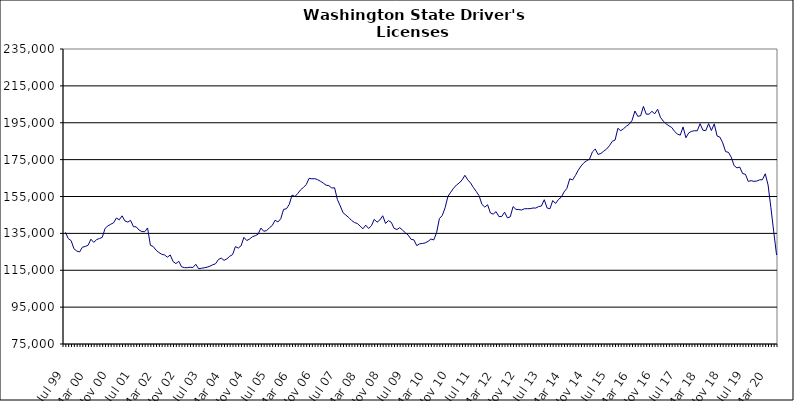
| Category | Series 0 |
|---|---|
| Jul 99 | 135560 |
| Aug 99 | 132182 |
| Sep 99 | 131104 |
| Oct 99 | 126694 |
| Nov 99 | 125425 |
| Dec 99 | 124927 |
| Jan 00 | 127499 |
| Feb 00 | 127927 |
| Mar 00 | 128547 |
| Apr 00 | 131834 |
| May 00 | 130120 |
| Jun 00 | 131595 |
| Jul 00 | 132236 |
| Aug 00 | 132819 |
| Sep 00 | 137711 |
| Oct 00 | 139063 |
| Nov 00 | 139952 |
| Dec 00 | 140732 |
| Jan 01 | 143338 |
| Feb 01 | 142359 |
| Mar 01 | 144523 |
| Apr 01 | 141758 |
| May 01 | 141135 |
| Jun 01 | 142064 |
| Jul 01 | 138646 |
| Aug 01 | 138530 |
| Sep 01 | 136784 |
| Oct 01 | 135996 |
| Nov 01 | 135917 |
| Dec 01 | 137940 |
| Jan 02 | 128531 |
| Feb 02 | 127848 |
| Mar 02 | 125876 |
| Apr 02 | 124595 |
| May 02 | 123660 |
| Jun 02 | 123282 |
| Jul 02 | 122089 |
| Aug 02 | 123279 |
| Sep 02 | 119727 |
| Oct 02 | 118588 |
| Nov 02 | 119854 |
| Dec 02 | 116851 |
| Jan 03 | 116407 |
| Feb 03 | 116382 |
| Mar 03 | 116648 |
| Apr 03 | 116471 |
| May 03 | 118231 |
| Jun 03 | 115831 |
| Jul 03 | 116082 |
| Aug 03 | 116341 |
| Sep 03 | 116653 |
| Oct 03 | 117212 |
| Nov 03 | 117962 |
| Dec 03 | 118542 |
| Jan 04 | 120817 |
| Feb 04 | 121617 |
| Mar 04 | 120369 |
| Apr 04 | 121200 |
| May 04 | 122609 |
| Jun 04 | 123484 |
| Jul 04 | 127844 |
| Aug 04 | 127025 |
| Sep 04 | 128273 |
| Oct 04 | 132853 |
| Nov 04 | 131106 |
| Dec 04 | 131935 |
| Jan 05 | 133205 |
| Feb 05 | 133736 |
| Mar 05 | 134528 |
| Apr 05 | 137889 |
| May 05 | 136130 |
| Jun 05 | 136523 |
| Jul 05 | 137997 |
| Aug 05 | 139294 |
| Sep 05 | 142140 |
| Oct 05 | 141192 |
| Nov 05 | 142937 |
| Dec 05 | 148013 |
| Jan 06 | 148341 |
| Feb 06 | 150744 |
| Mar 06 | 155794 |
| Apr 06 | 154984 |
| May 06 | 156651 |
| Jun 06 | 158638 |
| Jul 06 | 159911 |
| Aug 06 | 161445 |
| Sep 06 | 164852 |
| Oct 06 | 164570 |
| Nov 06 | 164679 |
| Dec 06 | 164127 |
| Jan 07 | 163271 |
| Feb 07 | 162273 |
| Mar 07 | 161140 |
| Apr 07 | 160860 |
| May 07 | 159633 |
| Jun 07 | 159724 |
| Jul 07 | 153303 |
| Aug 07 | 149939 |
| Sep 07 | 146172 |
| Oct 07 | 144876 |
| Nov 07 | 143613 |
| Dec 07 | 142022 |
| Jan 08 | 140909 |
| Feb 08 | 140368 |
| Mar 08 | 138998 |
| Apr 08 | 137471 |
| May 08 | 139453 |
| Jun 08 | 137680 |
| Jul 08 | 139120 |
| Aug 08 | 142612 |
| Sep-08 | 141071 |
| Oct 08 | 142313 |
| Nov 08 | 144556 |
| Dec 08 | 140394 |
| Jan 09 | 141903 |
| Feb 09 | 141036 |
| Mar 09 | 137751 |
| Apr 09 | 137060 |
| May 09 | 138101 |
| Jun 09 | 136739 |
| Jul 09 | 135317 |
| Aug 09 | 134020 |
| Sep 09 | 131756 |
| Oct 09 | 131488 |
| Nov 09 | 128370 |
| Dec 09 | 129323 |
| Jan 10 | 129531 |
| Feb 10 | 129848 |
| Mar 10 | 130654 |
| Apr 10 | 131929 |
| May 10 | 131429 |
| Jun 10 | 135357 |
| Jul 10 | 143032 |
| Aug 10 | 144686 |
| Sep 10 | 148856 |
| Oct 10 | 155042 |
| Nov 10 | 157328 |
| Dec 10 | 159501 |
| Jan 11 | 161221 |
| Feb 11 | 162312 |
| Mar 11 | 163996 |
| Apr 11 | 166495 |
| May 11 | 164040 |
| Jun 11 | 162324 |
| Jul 11 | 159862 |
| Aug 11 | 157738 |
| Sep 11 | 155430 |
| Oct 11 | 150762 |
| Nov 11 | 149255 |
| Dec 11 | 150533 |
| Jan 12 | 146068 |
| Feb 12 | 145446 |
| Mar 12 | 146788 |
| Apr 12 | 144110 |
| May 12 | 144162 |
| Jun 12 | 146482 |
| Jul 12 | 143445 |
| Aug 12 | 143950 |
| Sep 12 | 149520 |
| Oct 12 | 148033 |
| Nov 12 | 147926 |
| Dec 12 | 147674 |
| Jan 13 | 148360 |
| Feb-13 | 148388 |
| Mar-13 | 148414 |
| Apr 13 | 148749 |
| May 13 | 148735 |
| Jun-13 | 149521 |
| Jul 13 | 149837 |
| Aug 13 | 153252 |
| Sep 13 | 148803 |
| Oct 13 | 148315 |
| Nov 13 | 152804 |
| Dec 13 | 151209 |
| Jan 14 | 153357 |
| Feb-14 | 154608 |
| Mar 14 | 157479 |
| Apr 14 | 159441 |
| May 14 | 164591 |
| Jun 14 | 163995 |
| Jul-14 | 166411 |
| Aug-14 | 169272 |
| Sep 14 | 171565 |
| Oct 14 | 173335 |
| Nov 14 | 174406 |
| Dec 14 | 175302 |
| Jan 15 | 179204 |
| Feb 15 | 180737 |
| Mar 15 | 177810 |
| Apr-15 | 178331 |
| May 15 | 179601 |
| Jun-15 | 180729 |
| Jul 15 | 182540 |
| Aug 15 | 184924 |
| Sep 15 | 185620 |
| Oct 15 | 192002 |
| Nov 15 | 190681 |
| Dec 15 | 191795 |
| Jan 16 | 193132 |
| Feb 16 | 194206 |
| Mar 16 | 196319 |
| Apr 16 | 201373 |
| May 16 | 198500 |
| Jun 16 | 198743 |
| Jul 16 | 203841 |
| Aug 16 | 199630 |
| Sep 16 | 199655 |
| Oct 16 | 201181 |
| Nov 16 | 199888 |
| Dec 16 | 202304 |
| Jan 17 | 197977 |
| Feb 17 | 195889 |
| Mar 17 | 194438 |
| Apr 17 | 193335 |
| May 17 | 192430 |
| Jun 17 | 190298 |
| Jul 17 | 188832 |
| Aug 17 | 188264 |
| Sep 17 | 192738 |
| Oct 17 | 186856 |
| Nov 17 | 189537 |
| Dec 17 | 190341 |
| Jan 18 | 190670 |
| Feb 18 | 190645 |
| Mar 18 | 194476 |
| Apr 18 | 190971 |
| May 18 | 190707 |
| Jun 18 | 194516 |
| Jul 18 | 190783 |
| Aug 18 | 194390 |
| Sep 18 | 187831 |
| Oct 18 | 187188 |
| Nov 18 | 184054 |
| Dec 18 | 179347 |
| Jan 19 | 178958 |
| Feb 19 | 176289 |
| Mar 19 | 171747 |
| Apr 19 | 170532 |
| May 19 | 170967 |
| Jun 19 | 167444 |
| Jul 19 | 167059 |
| Aug 19 | 163194 |
| Sep 19 | 163599 |
| Oct 19 | 163212 |
| Nov 19 | 163388 |
| Dec 19 | 164024 |
| Jan 20 | 164114 |
| Feb 20 | 167320 |
| Mar 20 | 161221 |
| Apr 20 | 148866 |
| May 20 | 135821 |
| Jun 20 | 123252 |